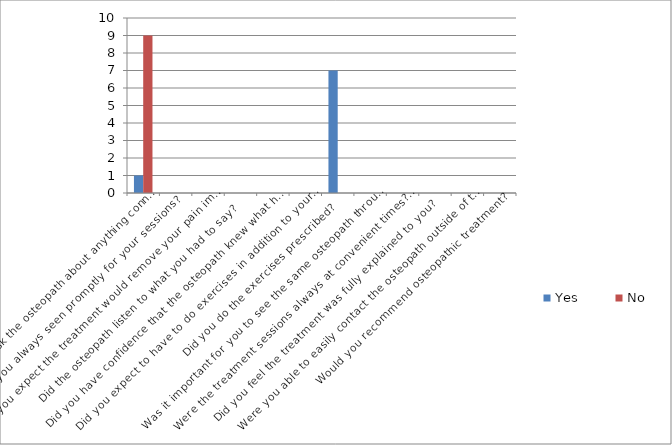
| Category | Yes | No |
|---|---|---|
| Were you able to ask the osteopath about anything connected with treatment? | 1 | 9 |
| Were you always seen promptly for your sessions?    | 0 | 0 |
| Did you expect the treatment would remove your pain immediately?    | 0 | 0 |
| Did the osteopath listen to what you had to say?      | 0 | 0 |
| Did you have confidence that the osteopath knew what he/she was doing?    | 0 | 0 |
| Did you expect to have to do exercises in addition to your treatment?   | 0 | 0 |
| Did you do the exercises prescribed?    | 7 | 0 |
| Was it important for you to see the same osteopath throughout your treatment?  | 0 | 0 |
| Were the treatment sessions always at convenient times?   | 0 | 0 |
| Did you feel the treatment was fully explained to you?    | 0 | 0 |
| Were you able to easily contact the osteopath outside of treatment hours?  | 0 | 0 |
| Would you recommend osteopathic treatment? | 0 | 0 |